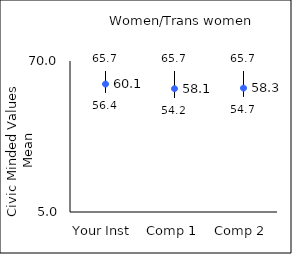
| Category | 25th percentile | 75th percentile | Mean |
|---|---|---|---|
| Your Inst | 56.4 | 65.7 | 60.07 |
| Comp 1 | 54.2 | 65.7 | 58.09 |
| Comp 2 | 54.7 | 65.7 | 58.34 |